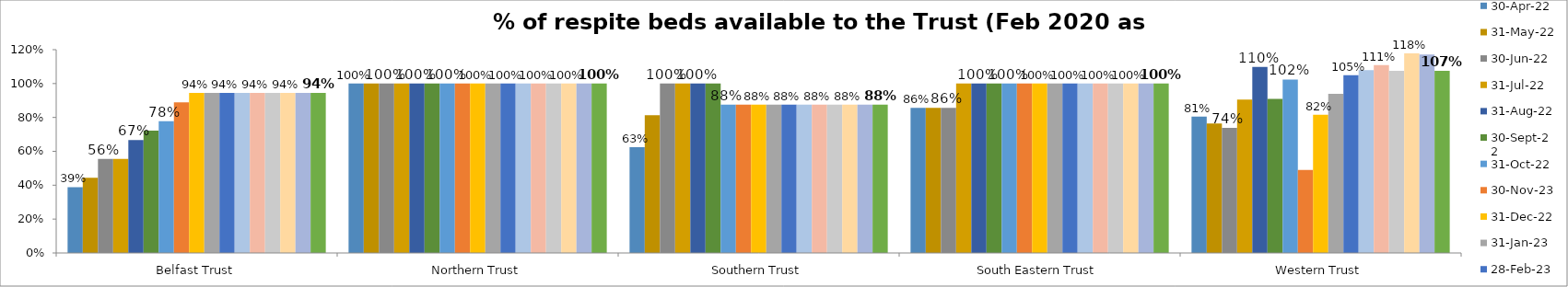
| Category | 30-Apr-22 | 31-May-22 | 30-Jun-22 | 31-Jul-22 | 31-Aug-22 | 30-Sep-22 | 31-Oct-22 | 30-Nov-23 | 31-Dec-22 | 31-Jan-23 | 28-Feb-23 | 31-Mar-23 | 30-Apr-23 | 31-May-23 | 30-Jun-23 | 31-Jul-23 | 31-Aug-23 |
|---|---|---|---|---|---|---|---|---|---|---|---|---|---|---|---|---|---|
| Belfast Trust | 0.389 | 0.444 | 0.556 | 0.556 | 0.667 | 0.722 | 0.778 | 0.889 | 0.944 | 0.944 | 0.944 | 0.944 | 0.944 | 0.944 | 0.944 | 0.944 | 0.944 |
| Northern Trust | 1 | 1 | 1 | 1 | 1 | 1 | 1 | 1 | 1 | 1 | 1 | 1 | 1 | 1 | 1 | 1 | 1 |
| Southern Trust | 0.625 | 0.812 | 1 | 1 | 1 | 1 | 0.875 | 0.875 | 0.875 | 0.875 | 0.875 | 0.875 | 0.875 | 0.875 | 0.875 | 0.875 | 0.875 |
| South Eastern Trust | 0.857 | 0.857 | 0.857 | 1 | 1 | 1 | 1 | 1 | 1 | 1 | 1 | 1 | 1 | 1 | 1 | 1 | 1 |
| Western Trust | 0.805 | 0.764 | 0.739 | 0.906 | 1.099 | 0.91 | 1.024 | 0.49 | 0.816 | 0.94 | 1.049 | 1.079 | 1.109 | 1.075 | 1.178 | 1.171 | 1.075 |